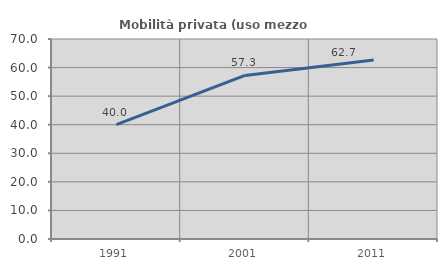
| Category | Mobilità privata (uso mezzo privato) |
|---|---|
| 1991.0 | 40 |
| 2001.0 | 57.258 |
| 2011.0 | 62.668 |